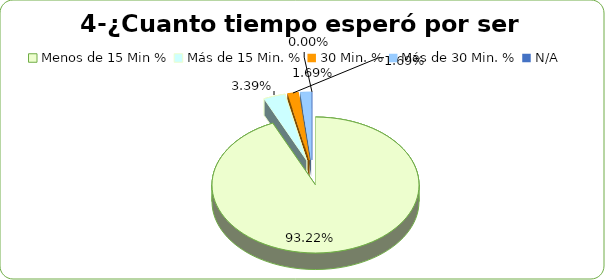
| Category | Series 0 |
|---|---|
| Menos de 15 Min % | 0.932 |
| Más de 15 Min. % | 0.034 |
| 30 Min. % | 0.017 |
| Más de 30 Min. % | 0.017 |
| N/A | 0 |